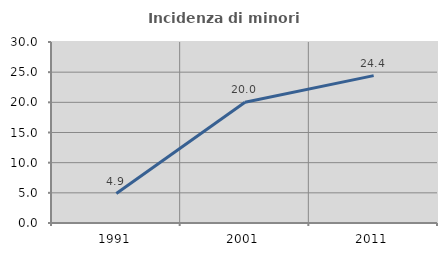
| Category | Incidenza di minori stranieri |
|---|---|
| 1991.0 | 4.878 |
| 2001.0 | 20 |
| 2011.0 | 24.429 |